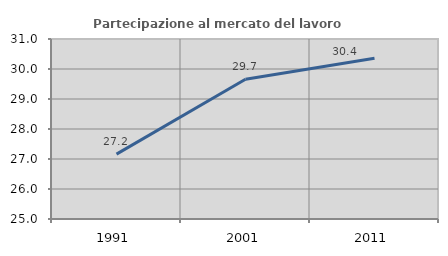
| Category | Partecipazione al mercato del lavoro  femminile |
|---|---|
| 1991.0 | 27.163 |
| 2001.0 | 29.659 |
| 2011.0 | 30.357 |